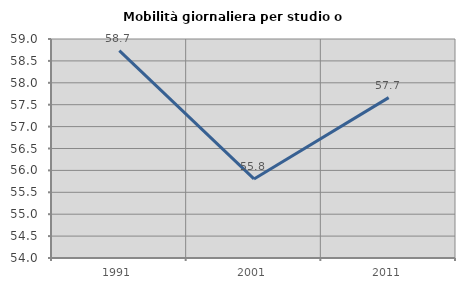
| Category | Mobilità giornaliera per studio o lavoro |
|---|---|
| 1991.0 | 58.735 |
| 2001.0 | 55.805 |
| 2011.0 | 57.662 |